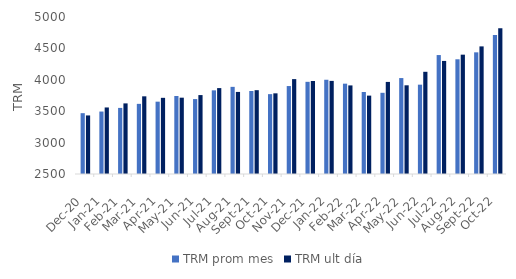
| Category | TRM prom mes | TRM ult día |
|---|---|---|
| 2020-12-01 | 3468.5 | 3432.5 |
| 2021-01-01 | 3494.53 | 3559.46 |
| 2021-02-01 | 3552.43 | 3624.39 |
| 2021-03-01 | 3617 | 3736.91 |
| 2021-04-01 | 3651.85 | 3712.89 |
| 2021-05-01 | 3741.96 | 3715.28 |
| 2021-06-01 | 3693 | 3756.67 |
| 2021-07-01 | 3832.24 | 3867.88 |
| 2021-08-01 | 3887.68 | 3806.87 |
| 2021-09-01 | 3821.54 | 3834.68 |
| 2021-10-01 | 3771.68 | 3784.44 |
| 2021-11-01 | 3900.51 | 4010.98 |
| 2021-12-01 | 3967.77 | 3981.16 |
| 2022-01-01 | 4000.72 | 3982.6 |
| 2022-02-01 | 3938.36 | 3910.64 |
| 2022-03-01 | 3805.52 | 3748.15 |
| 2022-04-01 | 3792.98 | 3966.27 |
| 2022-05-01 | 4027.6 | 3912.34 |
| 2022-06-01 | 3922.5 | 4127.47 |
| 2022-07-01 | 4394.01 | 4300.3 |
| 2022-08-01 | 4326.77 | 4400.16 |
| 2022-09-01 | 4437.31 | 4532.07 |
| 2022-10-01 | 4714.96 | 4819.42 |